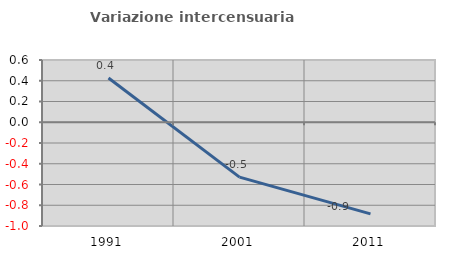
| Category | Variazione intercensuaria annua |
|---|---|
| 1991.0 | 0.427 |
| 2001.0 | -0.529 |
| 2011.0 | -0.883 |